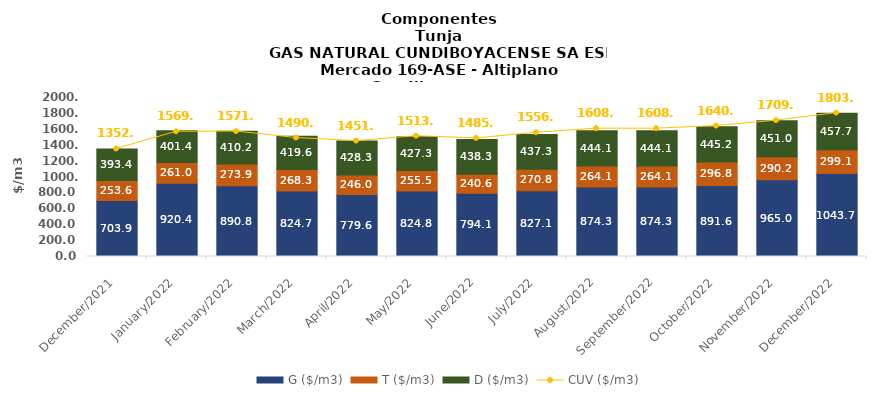
| Category | G ($/m3) | T ($/m3) | D ($/m3) |
|---|---|---|---|
| 2021-12-01 | 703.86 | 253.6 | 393.37 |
| 2022-01-01 | 920.37 | 261.03 | 401.37 |
| 2022-02-01 | 890.8 | 273.9 | 410.23 |
| 2022-03-01 | 824.74 | 268.34 | 419.57 |
| 2022-04-01 | 779.6 | 246.02 | 428.28 |
| 2022-05-01 | 824.78 | 255.51 | 427.34 |
| 2022-06-01 | 794.08 | 240.57 | 438.25 |
| 2022-07-01 | 827.1 | 270.77 | 437.28 |
| 2022-08-01 | 874.34 | 264.11 | 444.06 |
| 2022-09-01 | 874.34 | 264.11 | 444.06 |
| 2022-10-01 | 891.55 | 296.77 | 445.21 |
| 2022-11-01 | 964.95 | 290.22 | 450.99 |
| 2022-12-01 | 1043.68 | 299.05 | 457.65 |